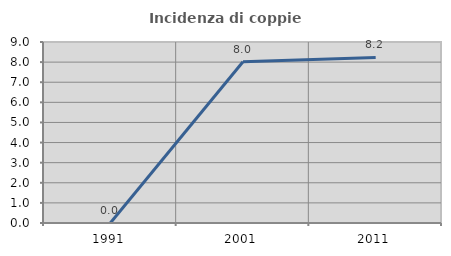
| Category | Incidenza di coppie miste |
|---|---|
| 1991.0 | 0 |
| 2001.0 | 8.019 |
| 2011.0 | 8.23 |